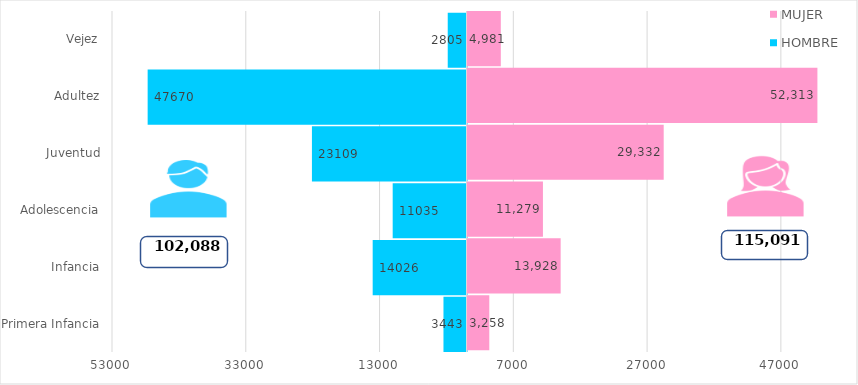
| Category | HOMBRE | MUJER |
|---|---|---|
| Primera Infancia | -3443 | 3258 |
| Infancia | -14026 | 13928 |
| Adolescencia | -11035 | 11279 |
| Juventud | -23109 | 29332 |
| Adultez | -47670 | 52313 |
| Vejez | -2805 | 4981 |